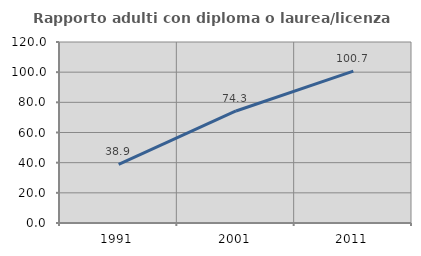
| Category | Rapporto adulti con diploma o laurea/licenza media  |
|---|---|
| 1991.0 | 38.94 |
| 2001.0 | 74.273 |
| 2011.0 | 100.705 |